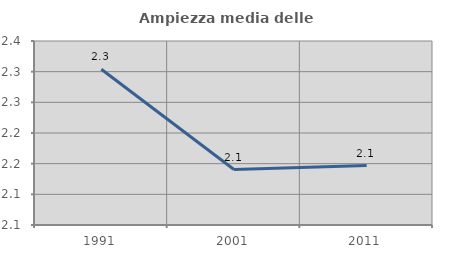
| Category | Ampiezza media delle famiglie |
|---|---|
| 1991.0 | 2.304 |
| 2001.0 | 2.14 |
| 2011.0 | 2.147 |